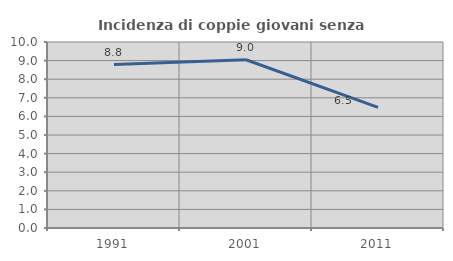
| Category | Incidenza di coppie giovani senza figli |
|---|---|
| 1991.0 | 8.784 |
| 2001.0 | 9.045 |
| 2011.0 | 6.489 |